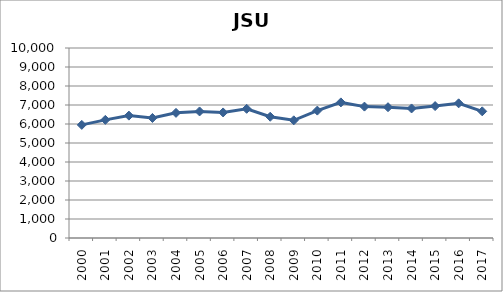
| Category | Series 0 |
|---|---|
| 2000.0 | 5953.542 |
| 2001.0 | 6217.875 |
| 2002.0 | 6441.367 |
| 2003.0 | 6317.633 |
| 2004.0 | 6586.217 |
| 2005.0 | 6660.542 |
| 2006.0 | 6607.904 |
| 2007.0 | 6798.55 |
| 2008.0 | 6381.883 |
| 2009.0 | 6193.721 |
| 2010.0 | 6705.421 |
| 2011.0 | 7136.892 |
| 2012.0 | 6915.417 |
| 2013.0 | 6883.233 |
| 2014.0 | 6818.562 |
| 2015.0 | 6942.846 |
| 2016.0 | 7087.95 |
| 2017.0 | 6666.208 |